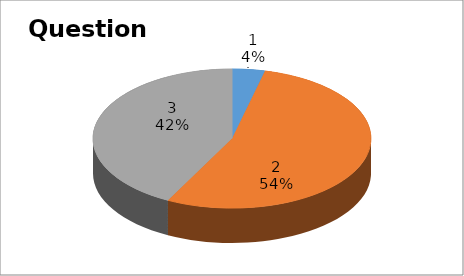
| Category | Series 0 |
|---|---|
| 0 | 8 |
| 1 | 113 |
| 2 | 89 |